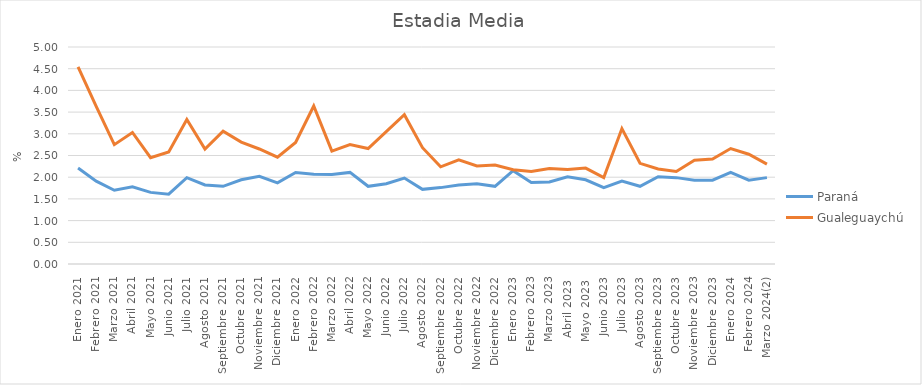
| Category | Paraná | Gualeguaychú |
|---|---|---|
| Enero 2021 | 2.21 | 4.54 |
| Febrero 2021 | 1.91 | 3.63 |
| Marzo 2021 | 1.7 | 2.75 |
| Abril 2021 | 1.78 | 3.03 |
| Mayo 2021 | 1.65 | 2.45 |
| Junio 2021 | 1.61 | 2.58 |
| Julio 2021 | 1.99 | 3.33 |
| Agosto 2021 | 1.82 | 2.65 |
| Septiembre 2021 | 1.79 | 3.06 |
| Octubre 2021 | 1.94 | 2.81 |
| Noviembre 2021 | 2.02 | 2.65 |
| Diciembre 2021 | 1.87 | 2.46 |
| Enero 2022 | 2.11 | 2.8 |
| Febrero 2022 | 2.07 | 3.64 |
| Marzo 2022 | 2.06 | 2.6 |
| Abril 2022 | 2.11 | 2.75 |
| Mayo 2022 | 1.79 | 2.66 |
| Junio 2022 | 1.85 | 3.05 |
| Julio 2022 | 1.98 | 3.44 |
| Agosto 2022 | 1.72 | 2.68 |
| Septiembre 2022 | 1.76 | 2.24 |
| Octubre 2022 | 1.82 | 2.4 |
| Noviembre 2022 | 1.85 | 2.26 |
| Diciembre 2022 | 1.79 | 2.28 |
| Enero 2023 | 2.15 | 2.17 |
| Febrero 2023 | 1.88 | 2.13 |
| Marzo 2023 | 1.89 | 2.2 |
| Abril 2023  | 2.01 | 2.18 |
| Mayo 2023  | 1.94 | 2.21 |
| Junio 2023 | 1.76 | 1.99 |
| Julio 2023 | 1.91 | 3.12 |
| Agosto 2023 | 1.79 | 2.32 |
| Septiembre 2023 | 2.01 | 2.19 |
| Octubre 2023 | 1.99 | 2.13 |
| Noviembre 2023 | 1.93 | 2.39 |
| Diciembre 2023 | 1.93 | 2.42 |
| Enero 2024 | 2.11 | 2.66 |
| Febrero 2024 | 1.93 | 2.53 |
| Marzo 2024(2) | 1.99 | 2.3 |